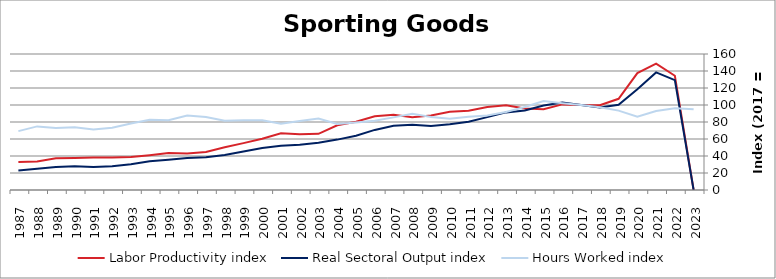
| Category | Labor Productivity index | Real Sectoral Output index | Hours Worked index |
|---|---|---|---|
| 2023.0 | 0 | 0 | 94.938 |
| 2022.0 | 134.405 | 129.304 | 96.205 |
| 2021.0 | 148.732 | 138.368 | 93.032 |
| 2020.0 | 137.477 | 118.631 | 86.291 |
| 2019.0 | 107.29 | 100.198 | 93.391 |
| 2018.0 | 99.829 | 97.164 | 97.33 |
| 2017.0 | 100 | 100 | 100 |
| 2016.0 | 100.73 | 102.878 | 102.132 |
| 2015.0 | 94.905 | 99.342 | 104.675 |
| 2014.0 | 95.905 | 93.6 | 97.596 |
| 2013.0 | 99.561 | 91.302 | 91.704 |
| 2012.0 | 97.738 | 85.722 | 87.706 |
| 2011.0 | 93.18 | 80.274 | 86.15 |
| 2010.0 | 91.996 | 77.242 | 83.963 |
| 2009.0 | 87.651 | 75.205 | 85.8 |
| 2008.0 | 85.532 | 76.75 | 89.733 |
| 2007.0 | 88.576 | 75.67 | 85.43 |
| 2006.0 | 86.783 | 70.696 | 81.462 |
| 2005.0 | 80.317 | 63.819 | 79.459 |
| 2004.0 | 76.214 | 59.287 | 77.79 |
| 2003.0 | 66.049 | 55.524 | 84.065 |
| 2002.0 | 65.678 | 53.318 | 81.181 |
| 2001.0 | 66.826 | 52.021 | 77.844 |
| 2000.0 | 60.347 | 49.442 | 81.929 |
| 1999.0 | 55.144 | 45.203 | 81.972 |
| 1998.0 | 50.359 | 41.083 | 81.579 |
| 1997.0 | 44.787 | 38.5 | 85.963 |
| 1996.0 | 42.894 | 37.62 | 87.705 |
| 1995.0 | 43.565 | 35.703 | 81.953 |
| 1994.0 | 40.962 | 33.798 | 82.512 |
| 1993.0 | 38.736 | 30.273 | 78.153 |
| 1992.0 | 38.144 | 27.971 | 73.331 |
| 1991.0 | 38.204 | 27.17 | 71.119 |
| 1990.0 | 37.654 | 27.846 | 73.952 |
| 1989.0 | 37.241 | 27.176 | 72.974 |
| 1988.0 | 33.586 | 25.13 | 74.824 |
| 1987.0 | 32.95 | 22.813 | 69.236 |